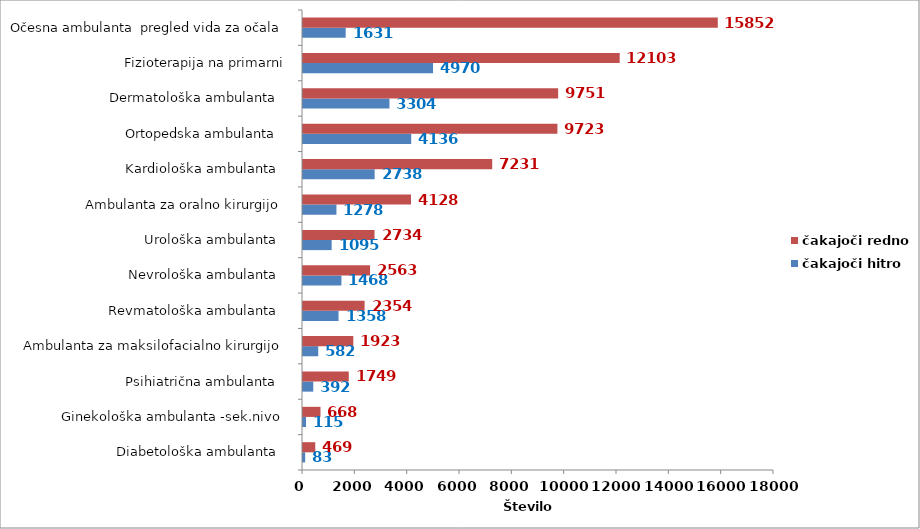
| Category | čakajoči hitro | čakajoči redno |
|---|---|---|
| Diabetološka ambulanta   | 83 | 469 |
| Ginekološka ambulanta -sek.nivo  | 115 | 668 |
| Psihiatrična ambulanta   | 392 | 1749 |
| Ambulanta za maksilofacialno kirurgijo  | 582 | 1923 |
| Revmatološka ambulanta   | 1358 | 2354 |
| Nevrološka ambulanta   | 1468 | 2563 |
| Urološka ambulanta   | 1095 | 2734 |
| Ambulanta za oralno kirurgijo  | 1278 | 4128 |
| Kardiološka ambulanta   | 2738 | 7231 |
| Ortopedska ambulanta   | 4136 | 9723 |
| Dermatološka ambulanta   | 3304 | 9751 |
| Fizioterapija na primarni | 4970 | 12103 |
| Očesna ambulanta  pregled vida za očala | 1631 | 15852 |